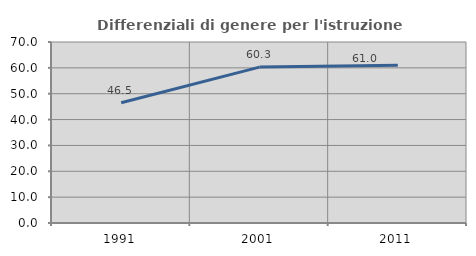
| Category | Differenziali di genere per l'istruzione superiore |
|---|---|
| 1991.0 | 46.487 |
| 2001.0 | 60.287 |
| 2011.0 | 60.962 |